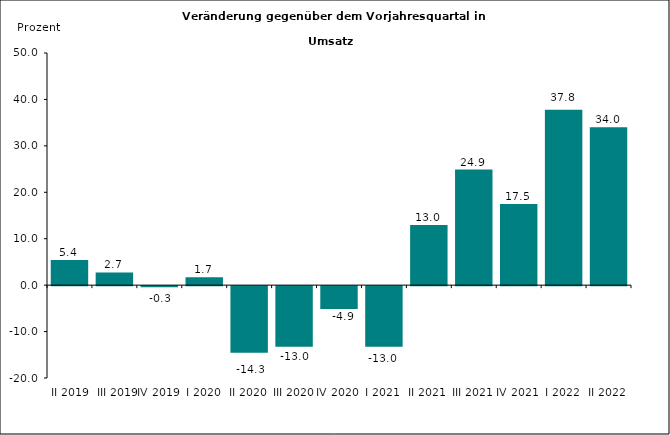
| Category | Series 0 |
|---|---|
|  II 2019 | 5.422 |
|  III 2019 | 2.73 |
| IV 2019 | -0.265 |
| I 2020 | 1.721 |
| II 2020 | -14.324 |
| III 2020 | -13.033 |
| IV 2020 | -4.938 |
| I 2021 | -13.038 |
| II 2021 | 12.95 |
| III 2021 | 24.9 |
| IV 2021 | 17.5 |
| I 2022 | 37.8 |
| II 2022 | 34 |